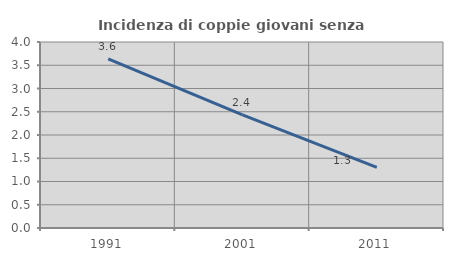
| Category | Incidenza di coppie giovani senza figli |
|---|---|
| 1991.0 | 3.636 |
| 2001.0 | 2.431 |
| 2011.0 | 1.303 |